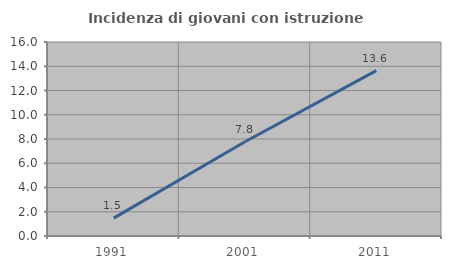
| Category | Incidenza di giovani con istruzione universitaria |
|---|---|
| 1991.0 | 1.471 |
| 2001.0 | 7.778 |
| 2011.0 | 13.636 |